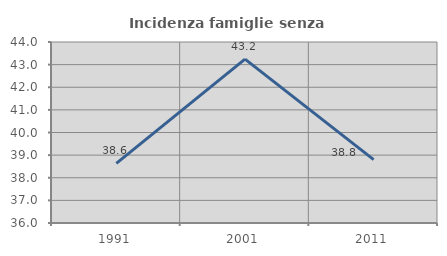
| Category | Incidenza famiglie senza nuclei |
|---|---|
| 1991.0 | 38.636 |
| 2001.0 | 43.243 |
| 2011.0 | 38.801 |